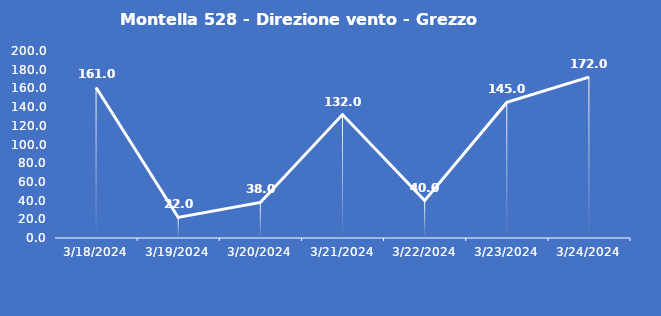
| Category | Montella 528 - Direzione vento - Grezzo (°N) |
|---|---|
| 3/18/24 | 161 |
| 3/19/24 | 22 |
| 3/20/24 | 38 |
| 3/21/24 | 132 |
| 3/22/24 | 40 |
| 3/23/24 | 145 |
| 3/24/24 | 172 |